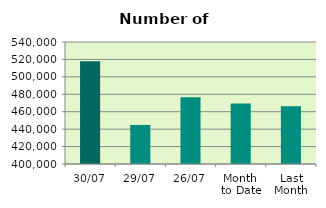
| Category | Series 0 |
|---|---|
| 30/07 | 517962 |
| 29/07 | 444800 |
| 26/07 | 476690 |
| Month 
to Date | 469293.091 |
| Last
Month | 466167.6 |